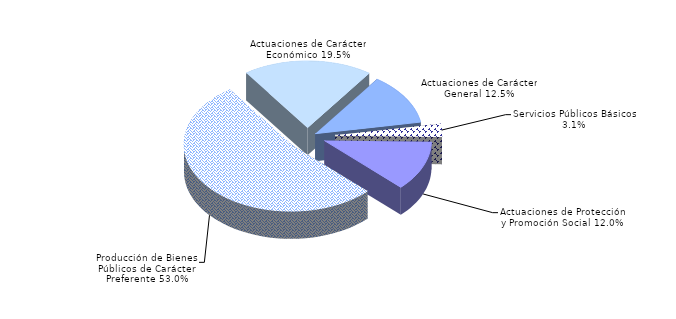
| Category | Series 0 |
|---|---|
| Servicios Públicos Básicos | 3.08 |
| Actuaciones de Protección y Promoción Social | 12.042 |
| Producción de Bienes Públicos de Carácter Preferente | 52.966 |
| Actuaciones de Carácter Económico | 19.46 |
| Actuaciones de Carácter General | 12.451 |